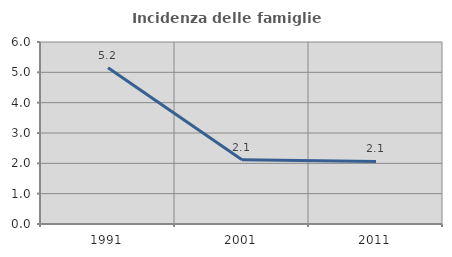
| Category | Incidenza delle famiglie numerose |
|---|---|
| 1991.0 | 5.151 |
| 2001.0 | 2.119 |
| 2011.0 | 2.063 |